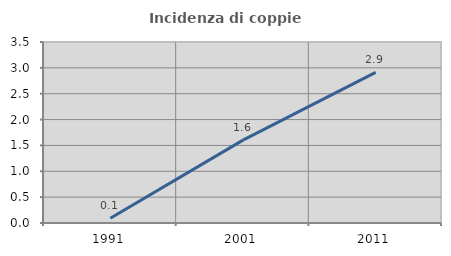
| Category | Incidenza di coppie miste |
|---|---|
| 1991.0 | 0.092 |
| 2001.0 | 1.602 |
| 2011.0 | 2.913 |